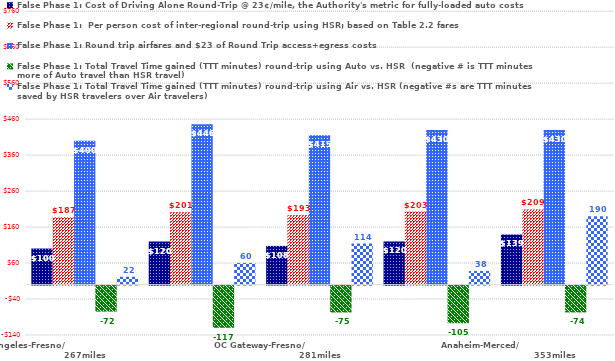
| Category | False Phase 1: Cost of Driving Alone Round-Trip @ 23¢/mile, the Authority's metric for fully-loaded auto costs | False Phase 1:  Per person cost of inter-regional round-trip using HSR; based on Table 2.2 fares | False Phase 1: Round trip airfares and $23 of Round Trip access+egress costs | False Phase 1: Total Travel Time gained (TTT minutes) round-trip using Auto vs. HSR  (negative # is TTT minutes more of Auto travel than HSR travel) | False Phase 1: Total Travel Time gained (TTT minutes) round-trip using Air vs. HSR (negative #s are TTT minutes saved by HSR travelers over Air travelers) |
|---|---|---|---|---|---|
| Los Angeles-Fresno/                                                267miles | 100.28 | 187 | 400 | -72.2 | 22 |
| Palmdale-Merced/                                               269miles | 119.6 | 201 | 446 | -117 | 60 |
| OC Gateway-Fresno/                                            281miles | 107.64 | 193 | 415 | -74.5 | 114 |
| Burbank-Merced/                                              320miles | 120.06 | 203 | 430 | -104.5 | 38 |
| Anaheim-Merced/                                                      353miles | 139.38 | 209 | 430 | -74.4 | 190 |